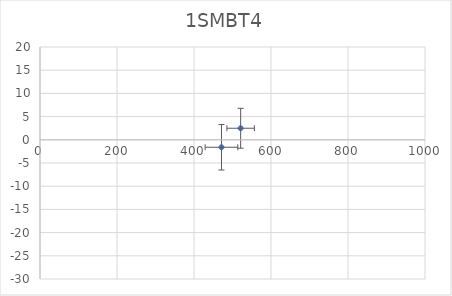
| Category | 1SMBT4 |
|---|---|
| 471.3495235698024 | -1.607 |
| 521.1448294691385 | 2.49 |